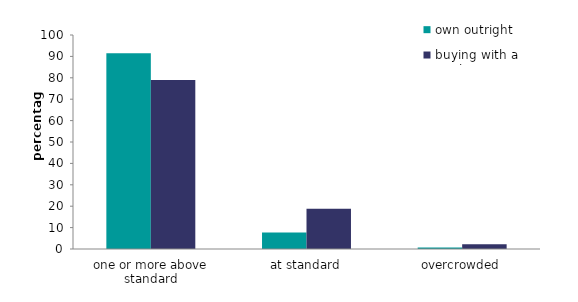
| Category | own outright | buying with a mortgage |
|---|---|---|
| one or more above standard | 91.512 | 78.942 |
| at standard | 7.748 | 18.835 |
| overcrowded | 0.74 | 2.223 |